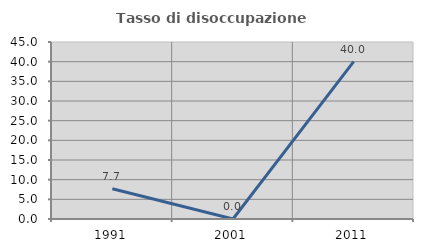
| Category | Tasso di disoccupazione giovanile  |
|---|---|
| 1991.0 | 7.692 |
| 2001.0 | 0 |
| 2011.0 | 40 |